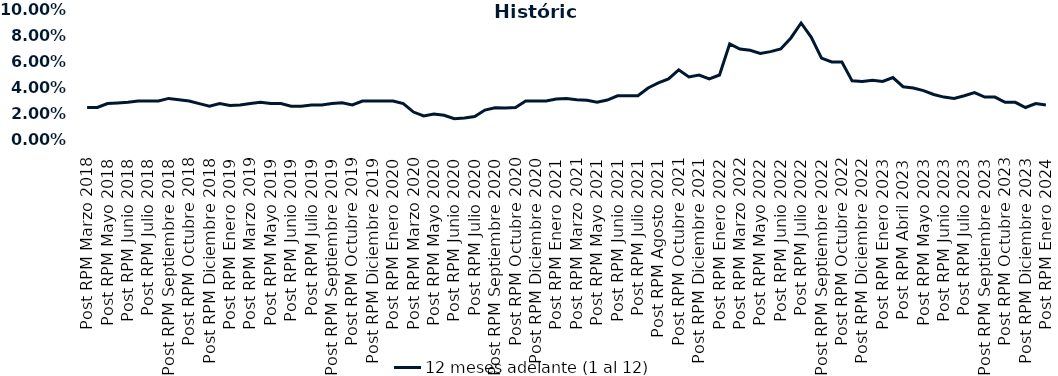
| Category | 12 meses adelante (1 al 12)  |
|---|---|
| Post RPM Marzo 2018 | 0.025 |
| Pre RPM Mayo 2018 | 0.025 |
| Post RPM Mayo 2018 | 0.028 |
| Pre RPM Junio 2018 | 0.028 |
| Post RPM Junio 2018 | 0.029 |
| Pre RPM Julio 2018 | 0.03 |
| Post RPM Julio 2018 | 0.03 |
| Pre RPM Septiembre 2018 | 0.03 |
| Post RPM Septiembre 2018 | 0.032 |
| Pre RPM Octubre 2018 | 0.031 |
| Post RPM Octubre 2018 | 0.03 |
| Pre RPM Diciembre 2018 | 0.028 |
| Post RPM Diciembre 2018 | 0.026 |
| Pre RPM Enero 2019 | 0.028 |
| Post RPM Enero 2019 | 0.026 |
| Pre RPM Marzo 2019 | 0.027 |
| Post RPM Marzo 2019 | 0.028 |
| Pre RPM Mayo 2019 | 0.029 |
| Post RPM Mayo 2019 | 0.028 |
| Pre RPM Junio 2019 | 0.028 |
| Post RPM Junio 2019 | 0.026 |
| Pre RPM Julio 2019 | 0.026 |
| Post RPM Julio 2019 | 0.027 |
| Pre RPM Septiembre 2019 | 0.027 |
| Post RPM Septiembre 2019 | 0.028 |
| Pre RPM Octubre 2019 | 0.029 |
| Post RPM Octubre 2019 | 0.027 |
| Pre RPM Diciembre 2019 | 0.03 |
| Post RPM Diciembre 2019 | 0.03 |
| Pre RPM Enero 2020 | 0.03 |
| Post RPM Enero 2020 | 0.03 |
| Pre RPM Marzo 2020 | 0.028 |
| Post RPM Marzo 2020 | 0.022 |
| Pre RPM Mayo 2020 | 0.018 |
| Post RPM Mayo 2020 | 0.02 |
| Pre RPM Junio 2020 | 0.019 |
| Post RPM Junio 2020 | 0.016 |
| Pre RPM Julio 2020 | 0.017 |
| Post RPM Julio 2020 | 0.018 |
| Pre RPM Septiembre 2020 | 0.023 |
| Post RPM Septiembre 2020 | 0.025 |
| Pre RPM Octubre 2020 | 0.025 |
| Post RPM Octubre 2020 | 0.025 |
| Pre RPM Diciembre 2020 | 0.03 |
| Post RPM Diciembre 2020 | 0.03 |
| Pre RPM Enero 2021 | 0.03 |
| Post RPM Enero 2021 | 0.032 |
| Pre RPM Marzo 2021 | 0.032 |
| Post RPM Marzo 2021 | 0.031 |
| Pre RPM Mayo 2021 | 0.03 |
| Post RPM Mayo 2021 | 0.029 |
| Pre RPM Junio 2021 | 0.031 |
| Post RPM Junio 2021 | 0.034 |
| Pre RPM Julio 2021 | 0.034 |
| Post RPM Julio 2021 | 0.034 |
| Pre RPM Agosto 2021 | 0.04 |
| Post RPM Agosto 2021 | 0.044 |
| Pre RPM Octubre 2021 | 0.047 |
| Post RPM Octubre 2021 | 0.054 |
| Pre RPM Diciembre 2021 | 0.048 |
| Post RPM Diciembre 2021 | 0.05 |
| Pre RPM Enero 2022 | 0.047 |
| Post RPM Enero 2022 | 0.05 |
| Pre RPM Marzo 2022 | 0.074 |
| Post RPM Marzo 2022 | 0.07 |
| Pre RPM Mayo 2022 | 0.069 |
| Post RPM Mayo 2022 | 0.066 |
| Pre RPM Junio 2022 | 0.068 |
| Post RPM Junio 2022 | 0.07 |
| Pre RPM Julio 2022 | 0.078 |
| Post RPM Julio 2022 | 0.09 |
| Pre RPM Septiembre 2022 | 0.079 |
| Post RPM Septiembre 2022 | 0.063 |
| Pre RPM Octubre 2022 | 0.06 |
| Post RPM Octubre 2022 | 0.06 |
| Pre RPM Diciembre 2022 | 0.046 |
| Post RPM Diciembre 2022 | 0.045 |
| Pre RPM Enero 2023 | 0.046 |
| Post RPM Enero 2023 | 0.045 |
| Pre RPM Abril 2023 | 0.048 |
| Post RPM Abril 2023 | 0.041 |
| Pre RPM Mayo 2023 | 0.04 |
| Post RPM Mayo 2023 | 0.038 |
| Pre RPM Junio 2023 | 0.035 |
| Post RPM Junio 2023 | 0.033 |
| Pre RPM Julio 2023 | 0.032 |
| Post RPM Julio 2023 | 0.034 |
| Pre RPM Septiembre 2023 | 0.036 |
| Post RPM Septiembre 2023 | 0.033 |
| Pre RPM Octubre 2023 | 0.033 |
| Post RPM Octubre 2023 | 0.029 |
| Pre RPM Diciembre 2023 | 0.029 |
| Post RPM Diciembre 2023 | 0.025 |
| Pre RPM Enero 2024 | 0.028 |
| Post RPM Enero 2024 | 0.027 |